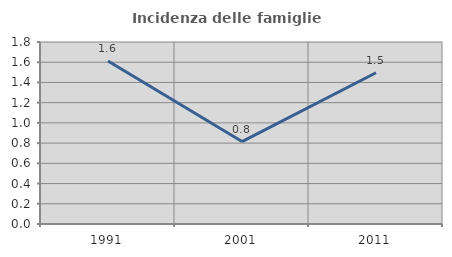
| Category | Incidenza delle famiglie numerose |
|---|---|
| 1991.0 | 1.613 |
| 2001.0 | 0.815 |
| 2011.0 | 1.496 |